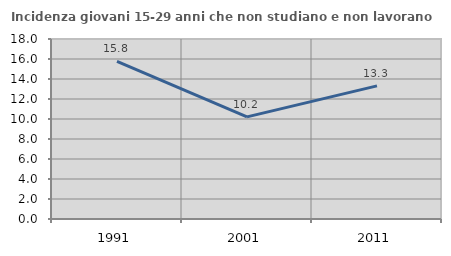
| Category | Incidenza giovani 15-29 anni che non studiano e non lavorano  |
|---|---|
| 1991.0 | 15.755 |
| 2001.0 | 10.21 |
| 2011.0 | 13.314 |